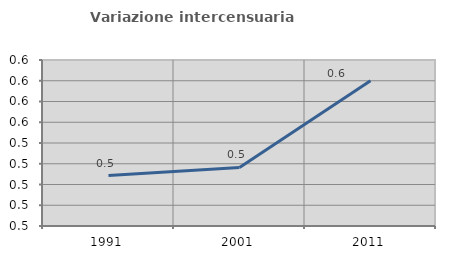
| Category | Variazione intercensuaria annua |
|---|---|
| 1991.0 | 0.499 |
| 2001.0 | 0.506 |
| 2011.0 | 0.59 |